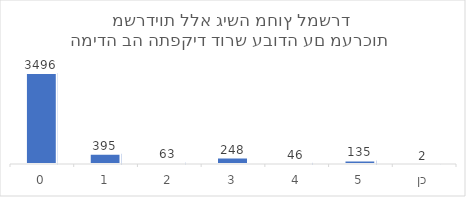
| Category | סה"כ |
|---|---|
| 0 | 3496 |
| 1 | 395 |
| 2 | 63 |
| 3 | 248 |
| 4 | 46 |
| 5 | 135 |
| כן | 2 |